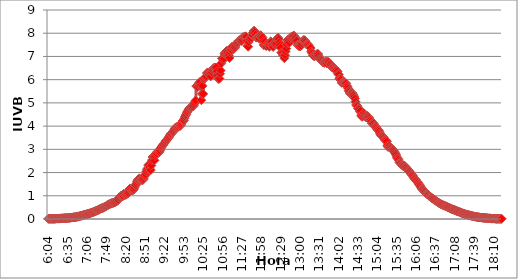
| Category | Series 0 |
|---|---|
| 0.25277777777777777 | 0.009 |
| 0.2534722222222222 | 0.009 |
| 0.25416666666666665 | 0.009 |
| 0.2548611111111111 | 0.009 |
| 0.2555555555555556 | 0.009 |
| 0.25625000000000003 | 0.009 |
| 0.2569444444444445 | 0.009 |
| 0.2576388888888889 | 0.009 |
| 0.25833333333333336 | 0.009 |
| 0.2590277777777778 | 0.009 |
| 0.25972222222222224 | 0.009 |
| 0.2604166666666667 | 0.009 |
| 0.2611111111111111 | 0.019 |
| 0.26180555555555557 | 0.019 |
| 0.2625 | 0.019 |
| 0.26319444444444445 | 0.019 |
| 0.2638888888888889 | 0.019 |
| 0.26458333333333334 | 0.019 |
| 0.2652777777777778 | 0.019 |
| 0.2659722222222222 | 0.019 |
| 0.26666666666666666 | 0.028 |
| 0.2673611111111111 | 0.028 |
| 0.26805555555555555 | 0.028 |
| 0.26875 | 0.028 |
| 0.26944444444444443 | 0.028 |
| 0.2701388888888889 | 0.037 |
| 0.2708333333333333 | 0.037 |
| 0.27152777777777776 | 0.037 |
| 0.2722222222222222 | 0.037 |
| 0.27291666666666664 | 0.037 |
| 0.2736111111111111 | 0.037 |
| 0.2743055555555555 | 0.047 |
| 0.27499999999999997 | 0.047 |
| 0.27569444444444446 | 0.047 |
| 0.27638888888888885 | 0.047 |
| 0.27708333333333335 | 0.056 |
| 0.2777777777777778 | 0.056 |
| 0.27847222222222223 | 0.065 |
| 0.2791666666666667 | 0.065 |
| 0.2798611111111111 | 0.065 |
| 0.28055555555555556 | 0.075 |
| 0.28125 | 0.075 |
| 0.28194444444444444 | 0.075 |
| 0.2826388888888889 | 0.084 |
| 0.2833333333333333 | 0.084 |
| 0.28402777777777777 | 0.093 |
| 0.2847222222222222 | 0.093 |
| 0.28541666666666665 | 0.103 |
| 0.28611111111111115 | 0.112 |
| 0.28680555555555554 | 0.112 |
| 0.28750000000000003 | 0.121 |
| 0.2881944444444445 | 0.13 |
| 0.2888888888888889 | 0.14 |
| 0.28958333333333336 | 0.14 |
| 0.2902777777777778 | 0.149 |
| 0.29097222222222224 | 0.158 |
| 0.2916666666666667 | 0.168 |
| 0.2923611111111111 | 0.177 |
| 0.29305555555555557 | 0.177 |
| 0.29375 | 0.186 |
| 0.29444444444444445 | 0.196 |
| 0.2951388888888889 | 0.205 |
| 0.29583333333333334 | 0.214 |
| 0.2965277777777778 | 0.214 |
| 0.2972222222222222 | 0.224 |
| 0.29791666666666666 | 0.233 |
| 0.2986111111111111 | 0.242 |
| 0.29930555555555555 | 0.252 |
| 0.3 | 0.261 |
| 0.30277777777777776 | 0.27 |
| 0.3055555555555555 | 0.28 |
| 0.30833333333333335 | 0.289 |
| 0.30972222222222223 | 0.298 |
| 0.3111111111111111 | 0.308 |
| 0.3125 | 0.326 |
| 0.31319444444444444 | 0.336 |
| 0.3138888888888889 | 0.345 |
| 0.3145833333333333 | 0.354 |
| 0.31527777777777777 | 0.363 |
| 0.3159722222222222 | 0.382 |
| 0.31666666666666665 | 0.391 |
| 0.31736111111111115 | 0.401 |
| 0.31805555555555554 | 0.419 |
| 0.31875000000000003 | 0.438 |
| 0.3194444444444445 | 0.447 |
| 0.3201388888888889 | 0.466 |
| 0.32083333333333336 | 0.466 |
| 0.3215277777777778 | 0.475 |
| 0.32222222222222224 | 0.485 |
| 0.3229166666666667 | 0.503 |
| 0.3236111111111111 | 0.522 |
| 0.32430555555555557 | 0.531 |
| 0.325 | 0.541 |
| 0.32569444444444445 | 0.559 |
| 0.3263888888888889 | 0.587 |
| 0.32708333333333334 | 0.596 |
| 0.3277777777777778 | 0.606 |
| 0.3284722222222222 | 0.634 |
| 0.32916666666666666 | 0.634 |
| 0.3298611111111111 | 0.652 |
| 0.33055555555555555 | 0.662 |
| 0.33125 | 0.68 |
| 0.33194444444444443 | 0.69 |
| 0.3326388888888889 | 0.69 |
| 0.3333333333333333 | 0.69 |
| 0.3340277777777778 | 0.708 |
| 0.3347222222222222 | 0.718 |
| 0.3354166666666667 | 0.727 |
| 0.3361111111111111 | 0.746 |
| 0.3368055555555556 | 0.764 |
| 0.33749999999999997 | 0.774 |
| 0.33819444444444446 | 0.802 |
| 0.33888888888888885 | 0.829 |
| 0.33958333333333335 | 0.904 |
| 0.34027777777777773 | 0.932 |
| 0.34097222222222223 | 0.932 |
| 0.3416666666666666 | 0.979 |
| 0.3423611111111111 | 1.016 |
| 0.3430555555555555 | 0.979 |
| 0.34375 | 0.988 |
| 0.3444444444444445 | 0.997 |
| 0.3451388888888889 | 1.09 |
| 0.3458333333333334 | 1.044 |
| 0.34652777777777777 | 1.044 |
| 0.34722222222222227 | 1.044 |
| 0.34791666666666665 | 1.062 |
| 0.34861111111111115 | 1.081 |
| 0.34930555555555554 | 1.1 |
| 0.35000000000000003 | 1.128 |
| 0.3506944444444444 | 1.212 |
| 0.3513888888888889 | 1.286 |
| 0.3520833333333333 | 1.314 |
| 0.3527777777777778 | 1.249 |
| 0.3534722222222222 | 1.277 |
| 0.3541666666666667 | 1.23 |
| 0.3548611111111111 | 1.23 |
| 0.35555555555555557 | 1.258 |
| 0.35625 | 1.286 |
| 0.35694444444444445 | 1.351 |
| 0.3576388888888889 | 1.445 |
| 0.35833333333333334 | 1.454 |
| 0.3590277777777778 | 1.519 |
| 0.3597222222222222 | 1.603 |
| 0.36041666666666666 | 1.668 |
| 0.3611111111111111 | 1.706 |
| 0.36180555555555555 | 1.687 |
| 0.3625 | 1.752 |
| 0.36319444444444443 | 1.696 |
| 0.3638888888888889 | 1.687 |
| 0.3645833333333333 | 1.687 |
| 0.3652777777777778 | 1.687 |
| 0.3659722222222222 | 1.668 |
| 0.3666666666666667 | 1.706 |
| 0.3673611111111111 | 1.761 |
| 0.3680555555555556 | 1.845 |
| 0.36874999999999997 | 1.873 |
| 0.36944444444444446 | 1.929 |
| 0.37013888888888885 | 2.041 |
| 0.37083333333333335 | 2.116 |
| 0.37152777777777773 | 2.181 |
| 0.37222222222222223 | 2.321 |
| 0.3729166666666666 | 2.227 |
| 0.3736111111111111 | 2.237 |
| 0.3743055555555555 | 2.144 |
| 0.375 | 2.106 |
| 0.3756944444444445 | 2.302 |
| 0.3763888888888889 | 2.535 |
| 0.3770833333333334 | 2.666 |
| 0.37777777777777777 | 2.684 |
| 0.37847222222222227 | 2.675 |
| 0.37916666666666665 | 2.526 |
| 0.37986111111111115 | 2.712 |
| 0.38055555555555554 | 2.805 |
| 0.38125000000000003 | 2.843 |
| 0.3819444444444444 | 2.815 |
| 0.3826388888888889 | 2.899 |
| 0.3833333333333333 | 2.926 |
| 0.3840277777777778 | 2.908 |
| 0.3847222222222222 | 2.889 |
| 0.3854166666666667 | 2.945 |
| 0.3861111111111111 | 3.038 |
| 0.38680555555555557 | 3.085 |
| 0.3875 | 3.122 |
| 0.38819444444444445 | 3.159 |
| 0.3888888888888889 | 3.197 |
| 0.38958333333333334 | 3.234 |
| 0.3902777777777778 | 3.271 |
| 0.3909722222222222 | 3.309 |
| 0.39166666666666666 | 3.355 |
| 0.3923611111111111 | 3.383 |
| 0.39305555555555555 | 3.42 |
| 0.39375 | 3.448 |
| 0.39444444444444443 | 3.486 |
| 0.3951388888888889 | 3.523 |
| 0.3958333333333333 | 3.57 |
| 0.3965277777777778 | 3.616 |
| 0.3972222222222222 | 3.653 |
| 0.3979166666666667 | 3.681 |
| 0.3986111111111111 | 3.719 |
| 0.3993055555555556 | 3.737 |
| 0.39999999999999997 | 3.765 |
| 0.40069444444444446 | 3.803 |
| 0.40138888888888885 | 3.858 |
| 0.40208333333333335 | 3.905 |
| 0.40277777777777773 | 3.942 |
| 0.40347222222222223 | 3.942 |
| 0.4041666666666666 | 3.961 |
| 0.4048611111111111 | 3.98 |
| 0.4055555555555555 | 3.97 |
| 0.40625 | 4.017 |
| 0.4069444444444445 | 4.008 |
| 0.4076388888888889 | 4.008 |
| 0.4083333333333334 | 4.045 |
| 0.40902777777777777 | 4.091 |
| 0.40972222222222227 | 4.147 |
| 0.41041666666666665 | 4.213 |
| 0.41111111111111115 | 4.231 |
| 0.41180555555555554 | 4.25 |
| 0.41250000000000003 | 4.334 |
| 0.4131944444444444 | 4.408 |
| 0.4138888888888889 | 4.474 |
| 0.4145833333333333 | 4.511 |
| 0.4152777777777778 | 4.585 |
| 0.4159722222222222 | 4.623 |
| 0.4173611111111111 | 4.679 |
| 0.41805555555555557 | 4.725 |
| 0.41875 | 4.763 |
| 0.41944444444444445 | 4.8 |
| 0.4201388888888889 | 4.828 |
| 0.42083333333333334 | 4.828 |
| 0.4215277777777778 | 4.874 |
| 0.4222222222222222 | 4.874 |
| 0.42291666666666666 | 4.846 |
| 0.4236111111111111 | 4.902 |
| 0.42430555555555555 | 4.968 |
| 0.425 | 5.042 |
| 0.42569444444444443 | 5.107 |
| 0.4263888888888889 | 5.722 |
| 0.4270833333333333 | 5.741 |
| 0.4277777777777778 | 5.685 |
| 0.4284722222222222 | 5.769 |
| 0.4291666666666667 | 5.844 |
| 0.4298611111111111 | 5.862 |
| 0.4305555555555556 | 5.909 |
| 0.43124999999999997 | 5.75 |
| 0.43194444444444446 | 5.117 |
| 0.43263888888888885 | 5.387 |
| 0.43333333333333335 | 5.732 |
| 0.43402777777777773 | 5.387 |
| 0.43472222222222223 | 6.011 |
| 0.4354166666666666 | 6.049 |
| 0.4361111111111111 | 6.095 |
| 0.4368055555555555 | 6.133 |
| 0.4375 | 6.142 |
| 0.4381944444444445 | 6.282 |
| 0.4388888888888889 | 6.31 |
| 0.4395833333333334 | 6.291 |
| 0.44027777777777777 | 6.216 |
| 0.44097222222222227 | 6.291 |
| 0.44166666666666665 | 6.291 |
| 0.44236111111111115 | 6.142 |
| 0.44305555555555554 | 6.328 |
| 0.44375000000000003 | 6.319 |
| 0.4444444444444444 | 6.412 |
| 0.4451388888888889 | 6.459 |
| 0.4458333333333333 | 6.505 |
| 0.4465277777777778 | 6.505 |
| 0.4472222222222222 | 6.524 |
| 0.4479166666666667 | 6.524 |
| 0.4486111111111111 | 6.524 |
| 0.44930555555555557 | 6.366 |
| 0.45 | 6.179 |
| 0.45069444444444445 | 6.039 |
| 0.4513888888888889 | 6.03 |
| 0.45208333333333334 | 6.049 |
| 0.4527777777777778 | 6.254 |
| 0.4534722222222222 | 6.394 |
| 0.45416666666666666 | 6.701 |
| 0.4548611111111111 | 6.915 |
| 0.45555555555555555 | 6.925 |
| 0.45625 | 6.841 |
| 0.45694444444444443 | 6.906 |
| 0.4576388888888889 | 7.111 |
| 0.4583333333333333 | 7.148 |
| 0.4590277777777778 | 7.167 |
| 0.4597222222222222 | 7.223 |
| 0.4604166666666667 | 7.242 |
| 0.4611111111111111 | 7.186 |
| 0.4618055555555556 | 7.12 |
| 0.46249999999999997 | 7.037 |
| 0.46319444444444446 | 6.934 |
| 0.46388888888888885 | 7.186 |
| 0.46458333333333335 | 7.279 |
| 0.46527777777777773 | 7.288 |
| 0.46597222222222223 | 7.409 |
| 0.4666666666666666 | 7.419 |
| 0.4673611111111111 | 7.326 |
| 0.4680555555555555 | 7.326 |
| 0.46875 | 7.353 |
| 0.4694444444444445 | 7.391 |
| 0.4701388888888889 | 7.465 |
| 0.4708333333333334 | 7.531 |
| 0.47152777777777777 | 7.577 |
| 0.47222222222222227 | 7.596 |
| 0.47291666666666665 | 7.624 |
| 0.47361111111111115 | 7.68 |
| 0.47430555555555554 | 7.698 |
| 0.47500000000000003 | 7.698 |
| 0.4756944444444444 | 7.698 |
| 0.4763888888888889 | 7.689 |
| 0.4770833333333333 | 7.661 |
| 0.4777777777777778 | 7.726 |
| 0.4784722222222222 | 7.838 |
| 0.4791666666666667 | 7.81 |
| 0.4798611111111111 | 7.838 |
| 0.48055555555555557 | 7.857 |
| 0.48125 | 7.866 |
| 0.48194444444444445 | 7.838 |
| 0.4826388888888889 | 7.67 |
| 0.48333333333333334 | 7.447 |
| 0.4840277777777778 | 7.419 |
| 0.4847222222222222 | 7.624 |
| 0.48541666666666666 | 7.745 |
| 0.4861111111111111 | 7.745 |
| 0.48680555555555555 | 7.838 |
| 0.4875 | 7.801 |
| 0.48819444444444443 | 7.913 |
| 0.4888888888888889 | 7.922 |
| 0.4895833333333333 | 8.034 |
| 0.4902777777777778 | 8.099 |
| 0.4909722222222222 | 8.099 |
| 0.4916666666666667 | 8.043 |
| 0.4923611111111111 | 7.931 |
| 0.4930555555555556 | 7.81 |
| 0.49374999999999997 | 7.819 |
| 0.49444444444444446 | 7.829 |
| 0.49513888888888885 | 7.866 |
| 0.49583333333333335 | 7.847 |
| 0.49652777777777773 | 7.764 |
| 0.49722222222222223 | 7.875 |
| 0.4979166666666666 | 7.913 |
| 0.4986111111111111 | 7.866 |
| 0.4993055555555555 | 7.819 |
| 0.5 | 7.81 |
| 0.5006944444444444 | 7.661 |
| 0.5013888888888889 | 7.484 |
| 0.5020833333333333 | 7.512 |
| 0.5027777777777778 | 7.633 |
| 0.5034722222222222 | 7.484 |
| 0.5041666666666667 | 7.447 |
| 0.5048611111111111 | 7.549 |
| 0.5055555555555555 | 7.493 |
| 0.50625 | 7.531 |
| 0.5069444444444444 | 7.503 |
| 0.5076388888888889 | 7.419 |
| 0.5083333333333333 | 7.503 |
| 0.5090277777777777 | 7.642 |
| 0.5097222222222222 | 7.614 |
| 0.5104166666666666 | 7.493 |
| 0.5111111111111112 | 7.503 |
| 0.5118055555555555 | 7.409 |
| 0.5125000000000001 | 7.549 |
| 0.5131944444444444 | 7.568 |
| 0.513888888888889 | 7.503 |
| 0.5145833333333333 | 7.521 |
| 0.5152777777777778 | 7.577 |
| 0.5159722222222222 | 7.736 |
| 0.5166666666666667 | 7.773 |
| 0.517361111111111 | 7.801 |
| 0.5180555555555556 | 7.745 |
| 0.5187499999999999 | 7.605 |
| 0.5194444444444445 | 7.484 |
| 0.5201388888888888 | 7.372 |
| 0.5208333333333334 | 7.158 |
| 0.5215277777777778 | 7.176 |
| 0.5222222222222223 | 7.167 |
| 0.5229166666666667 | 7.037 |
| 0.5236111111111111 | 7.037 |
| 0.5243055555555556 | 6.925 |
| 0.525 | 7.055 |
| 0.5256944444444445 | 7.214 |
| 0.5263888888888889 | 7.335 |
| 0.5270833333333333 | 7.531 |
| 0.5277777777777778 | 7.708 |
| 0.5284722222222222 | 7.661 |
| 0.5291666666666667 | 7.568 |
| 0.5298611111111111 | 7.605 |
| 0.5305555555555556 | 7.754 |
| 0.53125 | 7.819 |
| 0.5319444444444444 | 7.838 |
| 0.5326388888888889 | 7.801 |
| 0.5333333333333333 | 7.857 |
| 0.5340277777777778 | 7.847 |
| 0.5347222222222222 | 7.903 |
| 0.5354166666666667 | 7.857 |
| 0.5361111111111111 | 7.801 |
| 0.5368055555555555 | 7.801 |
| 0.5375 | 7.717 |
| 0.5381944444444444 | 7.67 |
| 0.5388888888888889 | 7.512 |
| 0.5395833333333333 | 7.475 |
| 0.5402777777777777 | 7.456 |
| 0.5409722222222222 | 7.437 |
| 0.5416666666666666 | 7.428 |
| 0.5423611111111112 | 7.484 |
| 0.5430555555555555 | 7.465 |
| 0.5437500000000001 | 7.568 |
| 0.5444444444444444 | 7.67 |
| 0.545138888888889 | 7.68 |
| 0.5458333333333333 | 7.708 |
| 0.5465277777777778 | 7.698 |
| 0.5472222222222222 | 7.689 |
| 0.5479166666666667 | 7.624 |
| 0.548611111111111 | 7.54 |
| 0.5493055555555556 | 7.512 |
| 0.5499999999999999 | 7.531 |
| 0.5506944444444445 | 7.521 |
| 0.5513888888888888 | 7.475 |
| 0.5520833333333334 | 7.409 |
| 0.5527777777777778 | 7.391 |
| 0.5534722222222223 | 7.363 |
| 0.5541666666666667 | 7.223 |
| 0.5548611111111111 | 7.167 |
| 0.5555555555555556 | 7.13 |
| 0.55625 | 7.046 |
| 0.5569444444444445 | 7.046 |
| 0.5576388888888889 | 6.999 |
| 0.5583333333333333 | 7.046 |
| 0.5590277777777778 | 7.046 |
| 0.5597222222222222 | 7.046 |
| 0.5604166666666667 | 7.093 |
| 0.5611111111111111 | 7.111 |
| 0.5618055555555556 | 7.102 |
| 0.5625 | 7.018 |
| 0.5631944444444444 | 6.925 |
| 0.5638888888888889 | 6.878 |
| 0.5645833333333333 | 6.878 |
| 0.5652777777777778 | 6.85 |
| 0.5659722222222222 | 6.841 |
| 0.5666666666666667 | 6.785 |
| 0.5673611111111111 | 6.738 |
| 0.5680555555555555 | 6.738 |
| 0.56875 | 6.72 |
| 0.5694444444444444 | 6.748 |
| 0.5701388888888889 | 6.776 |
| 0.5708333333333333 | 6.766 |
| 0.5715277777777777 | 6.701 |
| 0.5722222222222222 | 6.776 |
| 0.5729166666666666 | 6.738 |
| 0.5736111111111112 | 6.757 |
| 0.5743055555555555 | 6.682 |
| 0.5750000000000001 | 6.654 |
| 0.5756944444444444 | 6.664 |
| 0.576388888888889 | 6.589 |
| 0.5770833333333333 | 6.533 |
| 0.5777777777777778 | 6.533 |
| 0.5784722222222222 | 6.543 |
| 0.5791666666666667 | 6.524 |
| 0.579861111111111 | 6.487 |
| 0.5805555555555556 | 6.449 |
| 0.5812499999999999 | 6.421 |
| 0.5819444444444445 | 6.403 |
| 0.5826388888888888 | 6.347 |
| 0.5833333333333334 | 6.356 |
| 0.5840277777777778 | 6.254 |
| 0.5847222222222223 | 6.216 |
| 0.5854166666666667 | 6.058 |
| 0.5861111111111111 | 6.011 |
| 0.5868055555555556 | 6.049 |
| 0.5875 | 6.011 |
| 0.5881944444444445 | 5.862 |
| 0.5888888888888889 | 5.909 |
| 0.5895833333333333 | 5.909 |
| 0.5902777777777778 | 5.9 |
| 0.5909722222222222 | 5.881 |
| 0.5916666666666667 | 5.881 |
| 0.5923611111111111 | 5.862 |
| 0.5930555555555556 | 5.834 |
| 0.59375 | 5.741 |
| 0.5944444444444444 | 5.695 |
| 0.5951388888888889 | 5.629 |
| 0.5958333333333333 | 5.527 |
| 0.5965277777777778 | 5.48 |
| 0.5972222222222222 | 5.406 |
| 0.5979166666666667 | 5.378 |
| 0.5986111111111111 | 5.387 |
| 0.5993055555555555 | 5.434 |
| 0.6 | 5.415 |
| 0.6006944444444444 | 5.359 |
| 0.6013888888888889 | 5.331 |
| 0.6020833333333333 | 5.256 |
| 0.6027777777777777 | 5.182 |
| 0.6034722222222222 | 5.051 |
| 0.6041666666666666 | 4.912 |
| 0.6048611111111112 | 4.893 |
| 0.6055555555555555 | 4.856 |
| 0.6062500000000001 | 4.763 |
| 0.6069444444444444 | 4.753 |
| 0.607638888888889 | 4.707 |
| 0.6083333333333333 | 4.623 |
| 0.6090277777777778 | 4.66 |
| 0.6097222222222222 | 4.474 |
| 0.6104166666666667 | 4.408 |
| 0.611111111111111 | 4.408 |
| 0.6118055555555556 | 4.464 |
| 0.6124999999999999 | 4.567 |
| 0.6131944444444445 | 4.53 |
| 0.6138888888888888 | 4.464 |
| 0.6145833333333334 | 4.418 |
| 0.6152777777777778 | 4.371 |
| 0.6159722222222223 | 4.408 |
| 0.6166666666666667 | 4.436 |
| 0.6173611111111111 | 4.399 |
| 0.6180555555555556 | 4.38 |
| 0.61875 | 4.352 |
| 0.6194444444444445 | 4.287 |
| 0.6201388888888889 | 4.259 |
| 0.6208333333333333 | 4.203 |
| 0.6215277777777778 | 4.119 |
| 0.6222222222222222 | 4.129 |
| 0.6229166666666667 | 4.129 |
| 0.6236111111111111 | 4.11 |
| 0.6243055555555556 | 4.017 |
| 0.625 | 3.98 |
| 0.6256944444444444 | 3.98 |
| 0.6263888888888889 | 3.961 |
| 0.6270833333333333 | 3.914 |
| 0.6277777777777778 | 3.858 |
| 0.6284722222222222 | 3.831 |
| 0.6291666666666667 | 3.821 |
| 0.6298611111111111 | 3.775 |
| 0.6305555555555555 | 3.7 |
| 0.63125 | 3.644 |
| 0.6319444444444444 | 3.598 |
| 0.6326388888888889 | 3.57 |
| 0.6333333333333333 | 3.551 |
| 0.6340277777777777 | 3.542 |
| 0.6347222222222222 | 3.504 |
| 0.6354166666666666 | 3.448 |
| 0.6361111111111112 | 3.411 |
| 0.6368055555555555 | 3.383 |
| 0.6375000000000001 | 3.383 |
| 0.6381944444444444 | 3.327 |
| 0.638888888888889 | 3.169 |
| 0.6395833333333333 | 3.104 |
| 0.6402777777777778 | 3.122 |
| 0.6409722222222222 | 3.15 |
| 0.6416666666666667 | 3.094 |
| 0.642361111111111 | 3.076 |
| 0.6430555555555556 | 3.048 |
| 0.6437499999999999 | 2.992 |
| 0.6444444444444445 | 3.001 |
| 0.6451388888888888 | 2.992 |
| 0.6458333333333334 | 2.964 |
| 0.6465277777777778 | 2.908 |
| 0.6472222222222223 | 2.852 |
| 0.6479166666666667 | 2.805 |
| 0.6486111111111111 | 2.759 |
| 0.6493055555555556 | 2.675 |
| 0.65 | 2.61 |
| 0.6506944444444445 | 2.6 |
| 0.6513888888888889 | 2.544 |
| 0.6520833333333333 | 2.451 |
| 0.6527777777777778 | 2.423 |
| 0.6534722222222222 | 2.414 |
| 0.6541666666666667 | 2.377 |
| 0.6548611111111111 | 2.339 |
| 0.6555555555555556 | 2.311 |
| 0.65625 | 2.283 |
| 0.6569444444444444 | 2.311 |
| 0.6576388888888889 | 2.302 |
| 0.6583333333333333 | 2.265 |
| 0.6590277777777778 | 2.246 |
| 0.6597222222222222 | 2.218 |
| 0.6604166666666667 | 2.172 |
| 0.6611111111111111 | 2.134 |
| 0.6618055555555555 | 2.106 |
| 0.6625 | 2.078 |
| 0.6631944444444444 | 2.05 |
| 0.6638888888888889 | 2.022 |
| 0.6645833333333333 | 1.976 |
| 0.6652777777777777 | 1.939 |
| 0.6659722222222222 | 1.911 |
| 0.6666666666666666 | 1.892 |
| 0.6673611111111111 | 1.855 |
| 0.6680555555555556 | 1.799 |
| 0.6687500000000001 | 1.752 |
| 0.6694444444444444 | 1.724 |
| 0.6701388888888888 | 1.696 |
| 0.6708333333333334 | 1.668 |
| 0.6715277777777778 | 1.622 |
| 0.6722222222222222 | 1.603 |
| 0.6729166666666666 | 1.566 |
| 0.6736111111111112 | 1.519 |
| 0.6743055555555556 | 1.482 |
| 0.6749999999999999 | 1.445 |
| 0.6756944444444444 | 1.407 |
| 0.6763888888888889 | 1.351 |
| 0.6770833333333334 | 1.305 |
| 0.6777777777777777 | 1.286 |
| 0.6784722222222223 | 1.258 |
| 0.6791666666666667 | 1.24 |
| 0.6798611111111111 | 1.202 |
| 0.6805555555555555 | 1.174 |
| 0.68125 | 1.146 |
| 0.6819444444444445 | 1.1 |
| 0.6826388888888889 | 1.081 |
| 0.6833333333333332 | 1.072 |
| 0.6840277777777778 | 1.053 |
| 0.6847222222222222 | 1.025 |
| 0.6854166666666667 | 0.988 |
| 0.686111111111111 | 0.969 |
| 0.6868055555555556 | 0.951 |
| 0.6875 | 0.932 |
| 0.6881944444444444 | 0.913 |
| 0.688888888888889 | 0.885 |
| 0.6895833333333333 | 0.867 |
| 0.6902777777777778 | 0.848 |
| 0.6909722222222222 | 0.829 |
| 0.6916666666666668 | 0.811 |
| 0.6923611111111111 | 0.792 |
| 0.6930555555555555 | 0.774 |
| 0.69375 | 0.755 |
| 0.6944444444444445 | 0.736 |
| 0.6951388888888889 | 0.718 |
| 0.6958333333333333 | 0.699 |
| 0.6965277777777777 | 0.68 |
| 0.6972222222222223 | 0.671 |
| 0.6979166666666666 | 0.652 |
| 0.6986111111111111 | 0.634 |
| 0.6993055555555556 | 0.624 |
| 0.7000000000000001 | 0.615 |
| 0.7006944444444444 | 0.596 |
| 0.7013888888888888 | 0.587 |
| 0.7020833333333334 | 0.578 |
| 0.7027777777777778 | 0.569 |
| 0.7034722222222222 | 0.55 |
| 0.7041666666666666 | 0.541 |
| 0.7048611111111112 | 0.531 |
| 0.7055555555555556 | 0.513 |
| 0.7062499999999999 | 0.503 |
| 0.7069444444444444 | 0.494 |
| 0.7076388888888889 | 0.475 |
| 0.7083333333333334 | 0.466 |
| 0.7090277777777777 | 0.457 |
| 0.7097222222222223 | 0.438 |
| 0.7104166666666667 | 0.429 |
| 0.7111111111111111 | 0.419 |
| 0.7118055555555555 | 0.41 |
| 0.7125 | 0.401 |
| 0.7131944444444445 | 0.391 |
| 0.7138888888888889 | 0.382 |
| 0.7145833333333332 | 0.373 |
| 0.7152777777777778 | 0.354 |
| 0.7159722222222222 | 0.345 |
| 0.7166666666666667 | 0.336 |
| 0.717361111111111 | 0.326 |
| 0.7180555555555556 | 0.317 |
| 0.71875 | 0.308 |
| 0.7194444444444444 | 0.298 |
| 0.720138888888889 | 0.28 |
| 0.7208333333333333 | 0.27 |
| 0.7215277777777778 | 0.261 |
| 0.7222222222222222 | 0.252 |
| 0.7229166666666668 | 0.242 |
| 0.7236111111111111 | 0.233 |
| 0.7243055555555555 | 0.224 |
| 0.725 | 0.214 |
| 0.7256944444444445 | 0.205 |
| 0.7263888888888889 | 0.196 |
| 0.7270833333333333 | 0.196 |
| 0.7277777777777777 | 0.186 |
| 0.7284722222222223 | 0.177 |
| 0.7291666666666666 | 0.168 |
| 0.7298611111111111 | 0.158 |
| 0.7305555555555556 | 0.158 |
| 0.7312500000000001 | 0.149 |
| 0.7319444444444444 | 0.14 |
| 0.7326388888888888 | 0.13 |
| 0.7333333333333334 | 0.13 |
| 0.7340277777777778 | 0.121 |
| 0.7347222222222222 | 0.112 |
| 0.7354166666666666 | 0.112 |
| 0.7361111111111112 | 0.103 |
| 0.7368055555555556 | 0.103 |
| 0.7374999999999999 | 0.093 |
| 0.7381944444444444 | 0.093 |
| 0.7388888888888889 | 0.084 |
| 0.7395833333333334 | 0.084 |
| 0.7402777777777777 | 0.075 |
| 0.7409722222222223 | 0.075 |
| 0.7416666666666667 | 0.065 |
| 0.7423611111111111 | 0.065 |
| 0.7430555555555555 | 0.065 |
| 0.74375 | 0.056 |
| 0.7444444444444445 | 0.056 |
| 0.7451388888888889 | 0.056 |
| 0.7458333333333332 | 0.047 |
| 0.7465277777777778 | 0.047 |
| 0.7472222222222222 | 0.047 |
| 0.7479166666666667 | 0.047 |
| 0.748611111111111 | 0.037 |
| 0.7493055555555556 | 0.037 |
| 0.75 | 0.037 |
| 0.7506944444444444 | 0.028 |
| 0.751388888888889 | 0.028 |
| 0.7520833333333333 | 0.028 |
| 0.7527777777777778 | 0.028 |
| 0.7534722222222222 | 0.028 |
| 0.7541666666666668 | 0.019 |
| 0.7548611111111111 | 0.019 |
| 0.7555555555555555 | 0.019 |
| 0.75625 | 0.019 |
| 0.7569444444444445 | 0.019 |
| 0.7576388888888889 | 0.019 |
| 0.7583333333333333 | 0.019 |
| 0.7590277777777777 | 0.009 |
| 0.7597222222222223 | 0.009 |
| 0.7604166666666666 | 0.009 |
| 0.7611111111111111 | 0.009 |
| 0.7618055555555556 | 0.009 |
| 0.7625000000000001 | 0.009 |
| 0.7631944444444444 | 0.009 |
| 0.7638888888888888 | 0.009 |
| 0.7645833333333334 | 0.009 |
| 0.7652777777777778 | 0.009 |
| 0.7659722222222222 | 0.009 |